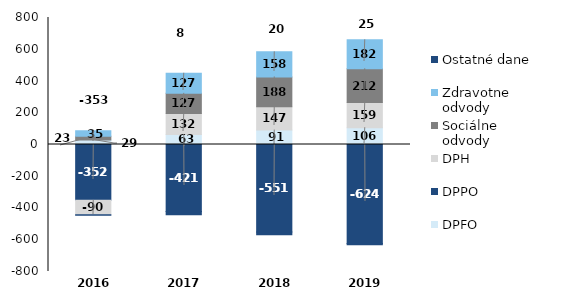
| Category | DPFO | DPPO | DPH | Sociálne odvody | Zdravotne odvody | Ostatné dane |
|---|---|---|---|---|---|---|
| 2016.0 | 28.572 | -351.824 | -89.993 | 22.823 | 34.559 | -4.461 |
| 2017.0 | 63.095 | -421.314 | 132.135 | 126.974 | 126.563 | -20.632 |
| 2018.0 | 90.794 | -551.017 | 146.773 | 188.064 | 158.018 | -17.202 |
| 2019.0 | 105.792 | -623.707 | 158.833 | 212.351 | 182.207 | -7.083 |